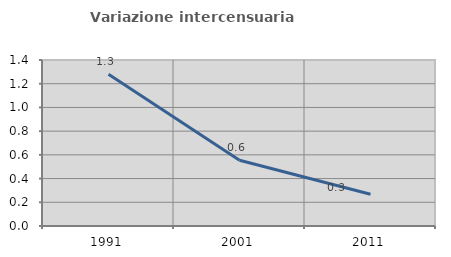
| Category | Variazione intercensuaria annua |
|---|---|
| 1991.0 | 1.28 |
| 2001.0 | 0.554 |
| 2011.0 | 0.268 |